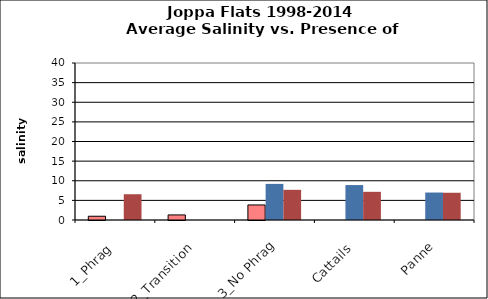
| Category | Filled | Reference | Restored 2 |
|---|---|---|---|
| 1_Phrag | 0.957 | 0 | 6.563 |
| 2_Transition | 1.292 | 0 | 0 |
| 3_No Phrag | 3.833 | 9.2 | 7.689 |
| Cattails | 0 | 8.9 | 7.179 |
| Panne | 0 | 7 | 6.941 |